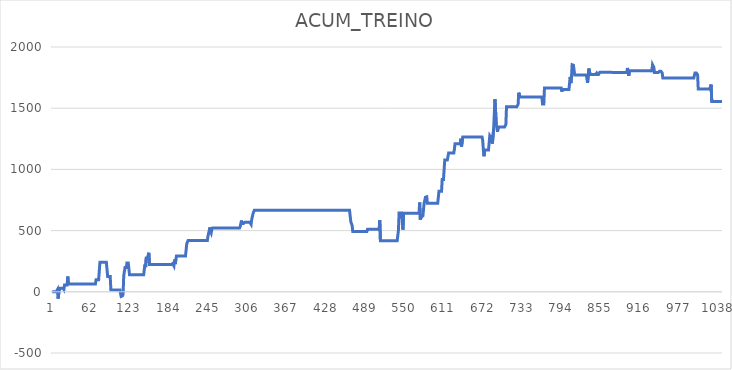
| Category | ACUM_TREINO |
|---|---|
| 0 | 0 |
| 1 | 0 |
| 2 | 0 |
| 3 | 0 |
| 4 | 0 |
| 5 | 0 |
| 6 | 0 |
| 7 | 0 |
| 8 | 18.4 |
| 9 | -55.7 |
| 10 | -55.7 |
| 11 | 29.2 |
| 12 | 29.2 |
| 13 | 29.2 |
| 14 | 29.2 |
| 15 | 29.2 |
| 16 | 29.2 |
| 17 | 29.2 |
| 18 | 19.5 |
| 19 | 55.4 |
| 20 | 55.4 |
| 21 | 55.4 |
| 22 | 55.4 |
| 23 | 55.4 |
| 24 | 125.1 |
| 25 | 63.5 |
| 26 | 63.5 |
| 27 | 63.5 |
| 28 | 63.5 |
| 29 | 63.5 |
| 30 | 63.5 |
| 31 | 63.5 |
| 32 | 63.5 |
| 33 | 63.5 |
| 34 | 63.5 |
| 35 | 63.5 |
| 36 | 63.5 |
| 37 | 63.5 |
| 38 | 63.5 |
| 39 | 63.5 |
| 40 | 63.5 |
| 41 | 63.5 |
| 42 | 63.5 |
| 43 | 63.5 |
| 44 | 63.5 |
| 45 | 63.5 |
| 46 | 63.5 |
| 47 | 63.5 |
| 48 | 63.5 |
| 49 | 63.5 |
| 50 | 63.5 |
| 51 | 63.5 |
| 52 | 63.5 |
| 53 | 63.5 |
| 54 | 63.5 |
| 55 | 63.5 |
| 56 | 63.5 |
| 57 | 63.5 |
| 58 | 63.5 |
| 59 | 63.5 |
| 60 | 63.5 |
| 61 | 63.5 |
| 62 | 63.5 |
| 63 | 63.5 |
| 64 | 63.5 |
| 65 | 63.5 |
| 66 | 63.5 |
| 67 | 63.5 |
| 68 | 98.5 |
| 69 | 98.5 |
| 70 | 98.5 |
| 71 | 98.5 |
| 72 | 98.5 |
| 73 | 98.5 |
| 74 | 240.8 |
| 75 | 240.8 |
| 76 | 240.8 |
| 77 | 240.8 |
| 78 | 240.8 |
| 79 | 240.8 |
| 80 | 240.8 |
| 81 | 240.8 |
| 82 | 240.8 |
| 83 | 240.8 |
| 84 | 240.8 |
| 85 | 240.8 |
| 86 | 125.9 |
| 87 | 125.9 |
| 88 | 125.9 |
| 89 | 125.9 |
| 90 | 125.9 |
| 91 | 15.2 |
| 92 | 15.2 |
| 93 | 15.2 |
| 94 | 15.2 |
| 95 | 15.2 |
| 96 | 15.2 |
| 97 | 15.2 |
| 98 | 15.2 |
| 99 | 15.2 |
| 100 | 15.2 |
| 101 | 15.2 |
| 102 | 15.2 |
| 103 | 15.2 |
| 104 | 15.2 |
| 105 | 15.2 |
| 106 | 15.2 |
| 107 | -38 |
| 108 | -38 |
| 109 | -33.2 |
| 110 | -21.4 |
| 111 | 131.4 |
| 112 | 131.4 |
| 113 | 197.6 |
| 114 | 197.6 |
| 115 | 197.6 |
| 116 | 236 |
| 117 | 236 |
| 118 | 236 |
| 119 | 236 |
| 120 | 138.7 |
| 121 | 138.7 |
| 122 | 138.7 |
| 123 | 138.7 |
| 124 | 138.7 |
| 125 | 138.7 |
| 126 | 138.7 |
| 127 | 138.7 |
| 128 | 138.7 |
| 129 | 138.7 |
| 130 | 138.7 |
| 131 | 138.7 |
| 132 | 138.7 |
| 133 | 138.7 |
| 134 | 138.7 |
| 135 | 138.7 |
| 136 | 138.7 |
| 137 | 138.7 |
| 138 | 138.7 |
| 139 | 138.7 |
| 140 | 138.7 |
| 141 | 138.7 |
| 142 | 138.7 |
| 143 | 185.4 |
| 144 | 223 |
| 145 | 200.7 |
| 146 | 276.8 |
| 147 | 278.7 |
| 148 | 278.7 |
| 149 | 278.5 |
| 150 | 319.3 |
| 151 | 223.1 |
| 152 | 223.1 |
| 153 | 223.1 |
| 154 | 223.1 |
| 155 | 223.1 |
| 156 | 223.1 |
| 157 | 223.1 |
| 158 | 223.1 |
| 159 | 223.1 |
| 160 | 223.1 |
| 161 | 223.1 |
| 162 | 223.1 |
| 163 | 223.1 |
| 164 | 223.1 |
| 165 | 223.1 |
| 166 | 223.1 |
| 167 | 223.1 |
| 168 | 223.1 |
| 169 | 223.1 |
| 170 | 223.1 |
| 171 | 223.1 |
| 172 | 223.1 |
| 173 | 223.1 |
| 174 | 223.1 |
| 175 | 223.1 |
| 176 | 223.1 |
| 177 | 223.1 |
| 178 | 223.1 |
| 179 | 223.1 |
| 180 | 223.1 |
| 181 | 223.1 |
| 182 | 223.1 |
| 183 | 223.1 |
| 184 | 223.1 |
| 185 | 223.1 |
| 186 | 230.7 |
| 187 | 230.7 |
| 188 | 230.7 |
| 189 | 211.4 |
| 190 | 263.5 |
| 191 | 226.2 |
| 192 | 259.1 |
| 193 | 292.7 |
| 194 | 292.7 |
| 195 | 292.7 |
| 196 | 292.7 |
| 197 | 292.7 |
| 198 | 292.7 |
| 199 | 292.7 |
| 200 | 292.7 |
| 201 | 292.7 |
| 202 | 292.7 |
| 203 | 292.7 |
| 204 | 292.7 |
| 205 | 292.7 |
| 206 | 292.7 |
| 207 | 292.7 |
| 208 | 292.7 |
| 209 | 393.9 |
| 210 | 393.9 |
| 211 | 419 |
| 212 | 419 |
| 213 | 419 |
| 214 | 419 |
| 215 | 419 |
| 216 | 419 |
| 217 | 419 |
| 218 | 419 |
| 219 | 419 |
| 220 | 419 |
| 221 | 419 |
| 222 | 419 |
| 223 | 419 |
| 224 | 419 |
| 225 | 419 |
| 226 | 419 |
| 227 | 419 |
| 228 | 419 |
| 229 | 419 |
| 230 | 419 |
| 231 | 419 |
| 232 | 419 |
| 233 | 419 |
| 234 | 419 |
| 235 | 419 |
| 236 | 419 |
| 237 | 419 |
| 238 | 419 |
| 239 | 419 |
| 240 | 419 |
| 241 | 419 |
| 242 | 455.3 |
| 243 | 479.8 |
| 244 | 502 |
| 245 | 526.9 |
| 246 | 494.2 |
| 247 | 481.3 |
| 248 | 512.5 |
| 249 | 520.7 |
| 250 | 520.7 |
| 251 | 520.7 |
| 252 | 520.7 |
| 253 | 520.7 |
| 254 | 520.7 |
| 255 | 520.7 |
| 256 | 520.7 |
| 257 | 520.7 |
| 258 | 520.7 |
| 259 | 520.7 |
| 260 | 520.7 |
| 261 | 520.7 |
| 262 | 520.7 |
| 263 | 520.7 |
| 264 | 520.7 |
| 265 | 520.7 |
| 266 | 520.7 |
| 267 | 520.7 |
| 268 | 520.7 |
| 269 | 520.7 |
| 270 | 520.7 |
| 271 | 520.7 |
| 272 | 520.7 |
| 273 | 520.7 |
| 274 | 520.7 |
| 275 | 520.7 |
| 276 | 520.7 |
| 277 | 520.7 |
| 278 | 520.7 |
| 279 | 520.7 |
| 280 | 520.7 |
| 281 | 520.7 |
| 282 | 520.7 |
| 283 | 520.7 |
| 284 | 520.7 |
| 285 | 520.7 |
| 286 | 520.7 |
| 287 | 520.7 |
| 288 | 520.7 |
| 289 | 520.7 |
| 290 | 520.7 |
| 291 | 520.7 |
| 292 | 532.3 |
| 293 | 530.7 |
| 294 | 582.3 |
| 295 | 557.1 |
| 296 | 557.1 |
| 297 | 557.1 |
| 298 | 557.1 |
| 299 | 567.2 |
| 300 | 567.2 |
| 301 | 567.2 |
| 302 | 567.2 |
| 303 | 567.2 |
| 304 | 567.2 |
| 305 | 567.2 |
| 306 | 567.2 |
| 307 | 567.2 |
| 308 | 567.2 |
| 309 | 550.6 |
| 310 | 594 |
| 311 | 594 |
| 312 | 637.9 |
| 313 | 653 |
| 314 | 665.3 |
| 315 | 665.3 |
| 316 | 665.3 |
| 317 | 665.3 |
| 318 | 665.3 |
| 319 | 665.3 |
| 320 | 665.3 |
| 321 | 665.3 |
| 322 | 665.3 |
| 323 | 665.3 |
| 324 | 665.3 |
| 325 | 665.3 |
| 326 | 665.3 |
| 327 | 665.3 |
| 328 | 665.3 |
| 329 | 665.3 |
| 330 | 665.3 |
| 331 | 665.3 |
| 332 | 665.3 |
| 333 | 665.3 |
| 334 | 665.3 |
| 335 | 665.3 |
| 336 | 665.3 |
| 337 | 665.3 |
| 338 | 665.3 |
| 339 | 665.3 |
| 340 | 665.3 |
| 341 | 665.3 |
| 342 | 665.3 |
| 343 | 665.3 |
| 344 | 665.3 |
| 345 | 665.3 |
| 346 | 665.3 |
| 347 | 665.3 |
| 348 | 665.3 |
| 349 | 665.3 |
| 350 | 665.3 |
| 351 | 665.3 |
| 352 | 665.3 |
| 353 | 665.3 |
| 354 | 665.3 |
| 355 | 665.3 |
| 356 | 665.3 |
| 357 | 665.3 |
| 358 | 665.3 |
| 359 | 665.3 |
| 360 | 665.3 |
| 361 | 665.3 |
| 362 | 665.3 |
| 363 | 665.3 |
| 364 | 665.3 |
| 365 | 665.3 |
| 366 | 665.3 |
| 367 | 665.3 |
| 368 | 665.3 |
| 369 | 665.3 |
| 370 | 665.3 |
| 371 | 665.3 |
| 372 | 665.3 |
| 373 | 665.3 |
| 374 | 665.3 |
| 375 | 665.3 |
| 376 | 665.3 |
| 377 | 665.3 |
| 378 | 665.3 |
| 379 | 665.3 |
| 380 | 665.3 |
| 381 | 665.3 |
| 382 | 665.3 |
| 383 | 665.3 |
| 384 | 665.3 |
| 385 | 665.3 |
| 386 | 665.3 |
| 387 | 665.3 |
| 388 | 665.3 |
| 389 | 665.3 |
| 390 | 665.3 |
| 391 | 665.3 |
| 392 | 665.3 |
| 393 | 665.3 |
| 394 | 665.3 |
| 395 | 665.3 |
| 396 | 665.3 |
| 397 | 665.3 |
| 398 | 665.3 |
| 399 | 665.3 |
| 400 | 665.3 |
| 401 | 665.3 |
| 402 | 665.3 |
| 403 | 665.3 |
| 404 | 665.3 |
| 405 | 665.3 |
| 406 | 665.3 |
| 407 | 665.3 |
| 408 | 665.3 |
| 409 | 665.3 |
| 410 | 665.3 |
| 411 | 665.3 |
| 412 | 665.3 |
| 413 | 665.3 |
| 414 | 665.3 |
| 415 | 665.3 |
| 416 | 665.3 |
| 417 | 665.3 |
| 418 | 665.3 |
| 419 | 665.3 |
| 420 | 665.3 |
| 421 | 665.3 |
| 422 | 665.3 |
| 423 | 665.3 |
| 424 | 665.3 |
| 425 | 665.3 |
| 426 | 665.3 |
| 427 | 665.3 |
| 428 | 665.3 |
| 429 | 665.3 |
| 430 | 665.3 |
| 431 | 665.3 |
| 432 | 665.3 |
| 433 | 665.3 |
| 434 | 665.3 |
| 435 | 665.3 |
| 436 | 665.3 |
| 437 | 665.3 |
| 438 | 665.3 |
| 439 | 665.3 |
| 440 | 665.3 |
| 441 | 665.3 |
| 442 | 665.3 |
| 443 | 665.3 |
| 444 | 665.3 |
| 445 | 665.3 |
| 446 | 665.3 |
| 447 | 665.3 |
| 448 | 665.3 |
| 449 | 665.3 |
| 450 | 665.3 |
| 451 | 665.3 |
| 452 | 665.3 |
| 453 | 665.3 |
| 454 | 665.3 |
| 455 | 665.3 |
| 456 | 665.3 |
| 457 | 665.3 |
| 458 | 665.3 |
| 459 | 665.3 |
| 460 | 665.3 |
| 461 | 665.3 |
| 462 | 665.3 |
| 463 | 665.3 |
| 464 | 571.5 |
| 465 | 571.5 |
| 466 | 542.7 |
| 467 | 493.5 |
| 468 | 493.5 |
| 469 | 493.5 |
| 470 | 493.5 |
| 471 | 493.5 |
| 472 | 493.5 |
| 473 | 493.5 |
| 474 | 493.5 |
| 475 | 493.5 |
| 476 | 493.5 |
| 477 | 493.5 |
| 478 | 493.5 |
| 479 | 493.5 |
| 480 | 493.5 |
| 481 | 493.5 |
| 482 | 493.5 |
| 483 | 493.5 |
| 484 | 493.5 |
| 485 | 493.5 |
| 486 | 493.5 |
| 487 | 493.5 |
| 488 | 493.5 |
| 489 | 493.5 |
| 490 | 511 |
| 491 | 511 |
| 492 | 511 |
| 493 | 511 |
| 494 | 511 |
| 495 | 511 |
| 496 | 511 |
| 497 | 511 |
| 498 | 511 |
| 499 | 511 |
| 500 | 511 |
| 501 | 511 |
| 502 | 511 |
| 503 | 511 |
| 504 | 511 |
| 505 | 511 |
| 506 | 511 |
| 507 | 511 |
| 508 | 511 |
| 509 | 584.8 |
| 510 | 416.2 |
| 511 | 416.2 |
| 512 | 416.2 |
| 513 | 416.2 |
| 514 | 416.2 |
| 515 | 416.2 |
| 516 | 416.2 |
| 517 | 416.2 |
| 518 | 416.2 |
| 519 | 416.2 |
| 520 | 416.2 |
| 521 | 416.2 |
| 522 | 416.2 |
| 523 | 416.2 |
| 524 | 416.2 |
| 525 | 416.2 |
| 526 | 416.2 |
| 527 | 416.2 |
| 528 | 416.2 |
| 529 | 416.2 |
| 530 | 416.2 |
| 531 | 416.2 |
| 532 | 416.2 |
| 533 | 416.2 |
| 534 | 416.2 |
| 535 | 416.2 |
| 536 | 416.2 |
| 537 | 416.2 |
| 538 | 502.8 |
| 539 | 644.8 |
| 540 | 644.8 |
| 541 | 644.8 |
| 542 | 644.8 |
| 543 | 644.8 |
| 544 | 644.8 |
| 545 | 507.9 |
| 546 | 642 |
| 547 | 642 |
| 548 | 642 |
| 549 | 642 |
| 550 | 642 |
| 551 | 642 |
| 552 | 642 |
| 553 | 642 |
| 554 | 642 |
| 555 | 642 |
| 556 | 642 |
| 557 | 642 |
| 558 | 642 |
| 559 | 642 |
| 560 | 642 |
| 561 | 642 |
| 562 | 642 |
| 563 | 642 |
| 564 | 642 |
| 565 | 642 |
| 566 | 642 |
| 567 | 642 |
| 568 | 642 |
| 569 | 642 |
| 570 | 642 |
| 571 | 729.6 |
| 572 | 589.9 |
| 573 | 589.9 |
| 574 | 620.6 |
| 575 | 620.6 |
| 576 | 620.6 |
| 577 | 620.6 |
| 578 | 725.8 |
| 579 | 725.8 |
| 580 | 772.3 |
| 581 | 772.3 |
| 582 | 776 |
| 583 | 722.6 |
| 584 | 722.6 |
| 585 | 722.6 |
| 586 | 722.6 |
| 587 | 722.6 |
| 588 | 722.6 |
| 589 | 722.6 |
| 590 | 722.6 |
| 591 | 722.6 |
| 592 | 722.6 |
| 593 | 722.6 |
| 594 | 722.6 |
| 595 | 722.6 |
| 596 | 722.6 |
| 597 | 722.6 |
| 598 | 722.6 |
| 599 | 722.6 |
| 600 | 722.6 |
| 601 | 821.3 |
| 602 | 821.3 |
| 603 | 821.3 |
| 604 | 821.3 |
| 605 | 821.3 |
| 606 | 916.5 |
| 607 | 916.5 |
| 608 | 916.5 |
| 609 | 916.5 |
| 610 | 1077.8 |
| 611 | 1077.8 |
| 612 | 1077.8 |
| 613 | 1077.8 |
| 614 | 1077.8 |
| 615 | 1077.8 |
| 616 | 1133.9 |
| 617 | 1133.9 |
| 618 | 1133.9 |
| 619 | 1133.9 |
| 620 | 1133.9 |
| 621 | 1133.9 |
| 622 | 1133.9 |
| 623 | 1133.9 |
| 624 | 1133.9 |
| 625 | 1165.8 |
| 626 | 1209.6 |
| 627 | 1209.6 |
| 628 | 1209.6 |
| 629 | 1209.6 |
| 630 | 1209.6 |
| 631 | 1209.6 |
| 632 | 1209.6 |
| 633 | 1209.6 |
| 634 | 1209.6 |
| 635 | 1250.9 |
| 636 | 1184.6 |
| 637 | 1191.9 |
| 638 | 1264.3 |
| 639 | 1264.3 |
| 640 | 1264.3 |
| 641 | 1264.3 |
| 642 | 1264.3 |
| 643 | 1264.3 |
| 644 | 1264.3 |
| 645 | 1264.3 |
| 646 | 1264.3 |
| 647 | 1264.3 |
| 648 | 1264.3 |
| 649 | 1264.3 |
| 650 | 1264.3 |
| 651 | 1264.3 |
| 652 | 1264.3 |
| 653 | 1264.3 |
| 654 | 1264.3 |
| 655 | 1264.3 |
| 656 | 1264.3 |
| 657 | 1264.3 |
| 658 | 1264.3 |
| 659 | 1264.3 |
| 660 | 1264.3 |
| 661 | 1264.3 |
| 662 | 1264.3 |
| 663 | 1264.3 |
| 664 | 1264.3 |
| 665 | 1264.3 |
| 666 | 1264.3 |
| 667 | 1264.3 |
| 668 | 1264.3 |
| 669 | 1236.5 |
| 670 | 1159 |
| 671 | 1107.5 |
| 672 | 1159.4 |
| 673 | 1159.4 |
| 674 | 1159.4 |
| 675 | 1159.4 |
| 676 | 1159.4 |
| 677 | 1159.4 |
| 678 | 1159.4 |
| 679 | 1159.4 |
| 680 | 1275 |
| 681 | 1266.5 |
| 682 | 1266.5 |
| 683 | 1266.5 |
| 684 | 1210.3 |
| 685 | 1210.3 |
| 686 | 1331.2 |
| 687 | 1331.2 |
| 688 | 1574 |
| 689 | 1574 |
| 690 | 1372.8 |
| 691 | 1372.8 |
| 692 | 1307.2 |
| 693 | 1346.8 |
| 694 | 1346.8 |
| 695 | 1346.8 |
| 696 | 1346.8 |
| 697 | 1346.8 |
| 698 | 1346.8 |
| 699 | 1346.8 |
| 700 | 1346.8 |
| 701 | 1346.8 |
| 702 | 1346.8 |
| 703 | 1346.8 |
| 704 | 1346.8 |
| 705 | 1368.1 |
| 706 | 1512.8 |
| 707 | 1512.8 |
| 708 | 1512.8 |
| 709 | 1512.8 |
| 710 | 1512.8 |
| 711 | 1512.8 |
| 712 | 1512.8 |
| 713 | 1512.8 |
| 714 | 1512.8 |
| 715 | 1512.8 |
| 716 | 1512.8 |
| 717 | 1512.8 |
| 718 | 1512.8 |
| 719 | 1512.8 |
| 720 | 1512.8 |
| 721 | 1512.8 |
| 722 | 1512.8 |
| 723 | 1510.6 |
| 724 | 1531 |
| 725 | 1626.9 |
| 726 | 1626.9 |
| 727 | 1590.5 |
| 728 | 1590.5 |
| 729 | 1590.5 |
| 730 | 1590.5 |
| 731 | 1590.5 |
| 732 | 1590.5 |
| 733 | 1590.5 |
| 734 | 1590.5 |
| 735 | 1590.5 |
| 736 | 1590.5 |
| 737 | 1590.5 |
| 738 | 1590.5 |
| 739 | 1590.5 |
| 740 | 1590.5 |
| 741 | 1590.5 |
| 742 | 1590.5 |
| 743 | 1590.5 |
| 744 | 1590.5 |
| 745 | 1590.5 |
| 746 | 1590.5 |
| 747 | 1590.5 |
| 748 | 1590.5 |
| 749 | 1590.5 |
| 750 | 1590.5 |
| 751 | 1590.5 |
| 752 | 1590.5 |
| 753 | 1590.5 |
| 754 | 1590.5 |
| 755 | 1590.5 |
| 756 | 1590.5 |
| 757 | 1590.5 |
| 758 | 1590.5 |
| 759 | 1590.5 |
| 760 | 1590.5 |
| 761 | 1590.5 |
| 762 | 1533.6 |
| 763 | 1533.6 |
| 764 | 1533.6 |
| 765 | 1665.9 |
| 766 | 1665.9 |
| 767 | 1665.9 |
| 768 | 1665.9 |
| 769 | 1665.9 |
| 770 | 1665.9 |
| 771 | 1665.9 |
| 772 | 1665.9 |
| 773 | 1665.9 |
| 774 | 1665.9 |
| 775 | 1665.9 |
| 776 | 1665.9 |
| 777 | 1665.9 |
| 778 | 1665.9 |
| 779 | 1665.9 |
| 780 | 1665.9 |
| 781 | 1665.9 |
| 782 | 1665.9 |
| 783 | 1665.9 |
| 784 | 1665.9 |
| 785 | 1665.9 |
| 786 | 1665.9 |
| 787 | 1665.9 |
| 788 | 1665.9 |
| 789 | 1665.9 |
| 790 | 1665.9 |
| 791 | 1665.9 |
| 792 | 1635.1 |
| 793 | 1651.8 |
| 794 | 1651.8 |
| 795 | 1651.8 |
| 796 | 1651.8 |
| 797 | 1651.8 |
| 798 | 1651.8 |
| 799 | 1651.8 |
| 800 | 1651.8 |
| 801 | 1651.8 |
| 802 | 1651.8 |
| 803 | 1651.8 |
| 804 | 1651.8 |
| 805 | 1755.7 |
| 806 | 1704.8 |
| 807 | 1755.4 |
| 808 | 1855.1 |
| 809 | 1851.3 |
| 810 | 1851.3 |
| 811 | 1851.3 |
| 812 | 1771 |
| 813 | 1771 |
| 814 | 1771 |
| 815 | 1771 |
| 816 | 1771 |
| 817 | 1771 |
| 818 | 1771 |
| 819 | 1771 |
| 820 | 1771 |
| 821 | 1771 |
| 822 | 1771 |
| 823 | 1771 |
| 824 | 1771 |
| 825 | 1771 |
| 826 | 1771 |
| 827 | 1771 |
| 828 | 1771 |
| 829 | 1771 |
| 830 | 1771 |
| 831 | 1740.8 |
| 832 | 1707.1 |
| 833 | 1707.1 |
| 834 | 1823.3 |
| 835 | 1823.3 |
| 836 | 1775.2 |
| 837 | 1775.2 |
| 838 | 1775.2 |
| 839 | 1775.2 |
| 840 | 1775.2 |
| 841 | 1775.2 |
| 842 | 1775.2 |
| 843 | 1775.2 |
| 844 | 1775.2 |
| 845 | 1775.2 |
| 846 | 1786.8 |
| 847 | 1775.4 |
| 848 | 1775.4 |
| 849 | 1775.4 |
| 850 | 1775.4 |
| 851 | 1793.6 |
| 852 | 1793.6 |
| 853 | 1793.6 |
| 854 | 1793.6 |
| 855 | 1793.6 |
| 856 | 1793.6 |
| 857 | 1793.6 |
| 858 | 1793.6 |
| 859 | 1793.6 |
| 860 | 1793.6 |
| 861 | 1793.6 |
| 862 | 1793.6 |
| 863 | 1793.6 |
| 864 | 1793.6 |
| 865 | 1793.6 |
| 866 | 1793.6 |
| 867 | 1793.6 |
| 868 | 1793.6 |
| 869 | 1793.6 |
| 870 | 1793.6 |
| 871 | 1790.9 |
| 872 | 1790.9 |
| 873 | 1790.9 |
| 874 | 1790.9 |
| 875 | 1790.9 |
| 876 | 1790.9 |
| 877 | 1790.9 |
| 878 | 1790.9 |
| 879 | 1790.9 |
| 880 | 1790.9 |
| 881 | 1790.9 |
| 882 | 1790.9 |
| 883 | 1790.9 |
| 884 | 1790.9 |
| 885 | 1790.9 |
| 886 | 1790.9 |
| 887 | 1790.9 |
| 888 | 1790.9 |
| 889 | 1790.9 |
| 890 | 1790.9 |
| 891 | 1790.9 |
| 892 | 1790.9 |
| 893 | 1790.9 |
| 894 | 1828.9 |
| 895 | 1828.9 |
| 896 | 1764.2 |
| 897 | 1806.3 |
| 898 | 1806.3 |
| 899 | 1806.3 |
| 900 | 1806.3 |
| 901 | 1806.3 |
| 902 | 1806.3 |
| 903 | 1806.3 |
| 904 | 1806.3 |
| 905 | 1806.3 |
| 906 | 1806.3 |
| 907 | 1806.3 |
| 908 | 1806.3 |
| 909 | 1806.3 |
| 910 | 1806.3 |
| 911 | 1806.3 |
| 912 | 1806.3 |
| 913 | 1806.3 |
| 914 | 1806.3 |
| 915 | 1806.3 |
| 916 | 1806.3 |
| 917 | 1806.3 |
| 918 | 1806.3 |
| 919 | 1806.3 |
| 920 | 1806.3 |
| 921 | 1806.3 |
| 922 | 1806.3 |
| 923 | 1806.3 |
| 924 | 1806.3 |
| 925 | 1806.3 |
| 926 | 1806.3 |
| 927 | 1806.3 |
| 928 | 1806.3 |
| 929 | 1806.3 |
| 930 | 1806.3 |
| 931 | 1806.3 |
| 932 | 1794.8 |
| 933 | 1855.2 |
| 934 | 1855.2 |
| 935 | 1833.4 |
| 936 | 1791.5 |
| 937 | 1791.5 |
| 938 | 1791.5 |
| 939 | 1791.5 |
| 940 | 1791.5 |
| 941 | 1791.5 |
| 942 | 1791.5 |
| 943 | 1791.5 |
| 944 | 1802.2 |
| 945 | 1802.2 |
| 946 | 1802.2 |
| 947 | 1802.2 |
| 948 | 1787.4 |
| 949 | 1745.8 |
| 950 | 1745.8 |
| 951 | 1745.8 |
| 952 | 1745.8 |
| 953 | 1745.8 |
| 954 | 1745.8 |
| 955 | 1745.8 |
| 956 | 1745.8 |
| 957 | 1745.8 |
| 958 | 1745.8 |
| 959 | 1745.8 |
| 960 | 1745.8 |
| 961 | 1745.8 |
| 962 | 1745.8 |
| 963 | 1745.8 |
| 964 | 1745.8 |
| 965 | 1745.8 |
| 966 | 1745.8 |
| 967 | 1745.8 |
| 968 | 1745.8 |
| 969 | 1745.8 |
| 970 | 1745.8 |
| 971 | 1745.8 |
| 972 | 1745.8 |
| 973 | 1745.8 |
| 974 | 1745.8 |
| 975 | 1745.8 |
| 976 | 1745.8 |
| 977 | 1745.8 |
| 978 | 1745.8 |
| 979 | 1745.8 |
| 980 | 1745.8 |
| 981 | 1745.8 |
| 982 | 1745.8 |
| 983 | 1745.8 |
| 984 | 1745.8 |
| 985 | 1745.8 |
| 986 | 1745.8 |
| 987 | 1745.8 |
| 988 | 1745.8 |
| 989 | 1745.8 |
| 990 | 1745.8 |
| 991 | 1745.8 |
| 992 | 1745.8 |
| 993 | 1745.8 |
| 994 | 1745.8 |
| 995 | 1745.8 |
| 996 | 1745.8 |
| 997 | 1745.8 |
| 998 | 1745.8 |
| 999 | 1787.8 |
| 1000 | 1787.8 |
| 1001 | 1787.8 |
| 1002 | 1787.8 |
| 1003 | 1773.3 |
| 1004 | 1657.1 |
| 1005 | 1657.1 |
| 1006 | 1657.1 |
| 1007 | 1657.1 |
| 1008 | 1657.1 |
| 1009 | 1657.1 |
| 1010 | 1657.1 |
| 1011 | 1657.1 |
| 1012 | 1657.1 |
| 1013 | 1657.1 |
| 1014 | 1657.1 |
| 1015 | 1657.1 |
| 1016 | 1657.1 |
| 1017 | 1657.1 |
| 1018 | 1657.1 |
| 1019 | 1657.1 |
| 1020 | 1657.1 |
| 1021 | 1657.1 |
| 1022 | 1657.1 |
| 1023 | 1657.1 |
| 1024 | 1693.2 |
| 1025 | 1555.3 |
| 1026 | 1555.3 |
| 1027 | 1555.3 |
| 1028 | 1555.3 |
| 1029 | 1555.3 |
| 1030 | 1555.3 |
| 1031 | 1555.3 |
| 1032 | 1555.3 |
| 1033 | 1555.3 |
| 1034 | 1555.3 |
| 1035 | 1555.3 |
| 1036 | 1555.3 |
| 1037 | 1555.3 |
| 1038 | 1555.3 |
| 1039 | 1555.3 |
| 1040 | 1555.3 |
| 1041 | 1555.3 |
| 1042 | 1555.3 |